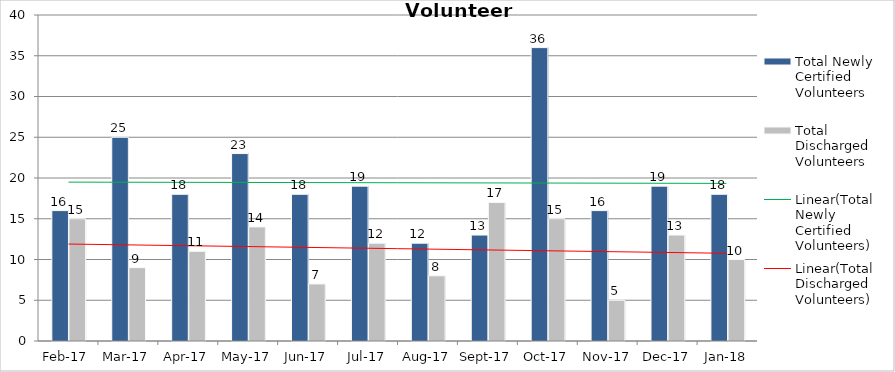
| Category | Total Newly Certified Volunteers | Total Discharged Volunteers |
|---|---|---|
| 2017-02-01 | 16 | 15 |
| 2017-03-01 | 25 | 9 |
| 2017-04-01 | 18 | 11 |
| 2017-05-01 | 23 | 14 |
| 2017-06-01 | 18 | 7 |
| 2017-07-01 | 19 | 12 |
| 2017-08-01 | 12 | 8 |
| 2017-09-01 | 13 | 17 |
| 2017-10-01 | 36 | 15 |
| 2017-11-01 | 16 | 5 |
| 2017-12-01 | 19 | 13 |
| 2018-01-01 | 18 | 10 |